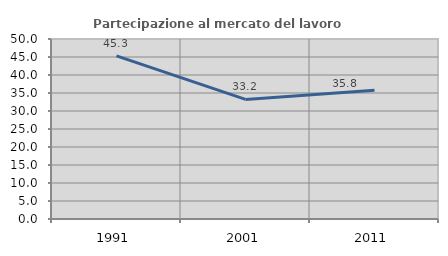
| Category | Partecipazione al mercato del lavoro  femminile |
|---|---|
| 1991.0 | 45.334 |
| 2001.0 | 33.217 |
| 2011.0 | 35.762 |